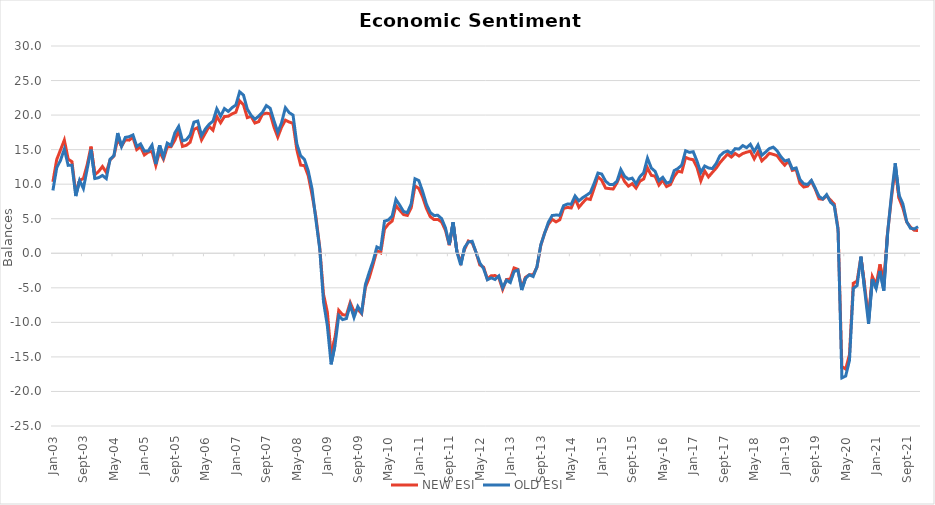
| Category | NEW ESI | OLD ESI |
|---|---|---|
| 2003-01-01 | 10.342 | 9.092 |
| 2003-02-01 | 13.567 | 12.367 |
| 2003-03-01 | 14.967 | 13.467 |
| 2003-04-01 | 16.383 | 15.083 |
| 2003-05-01 | 13.625 | 12.725 |
| 2003-06-01 | 13.25 | 12.75 |
| 2003-07-01 | 8.675 | 8.275 |
| 2003-08-01 | 10.542 | 10.542 |
| 2003-09-01 | 10.825 | 9.375 |
| 2003-10-01 | 12.825 | 12.225 |
| 2003-11-01 | 15.442 | 14.992 |
| 2003-12-01 | 11.367 | 10.817 |
| 2004-01-01 | 11.842 | 10.942 |
| 2004-02-01 | 12.558 | 11.258 |
| 2004-03-01 | 11.708 | 10.808 |
| 2004-04-01 | 13.508 | 13.608 |
| 2004-05-01 | 14.067 | 14.117 |
| 2004-06-01 | 16.55 | 17.4 |
| 2004-07-01 | 15.475 | 15.475 |
| 2004-08-01 | 16.425 | 16.775 |
| 2004-09-01 | 16.375 | 16.875 |
| 2004-10-01 | 16.775 | 17.125 |
| 2004-11-01 | 15.008 | 15.458 |
| 2004-12-01 | 15.425 | 15.825 |
| 2005-01-01 | 14.233 | 14.783 |
| 2005-02-01 | 14.642 | 14.792 |
| 2005-03-01 | 14.75 | 15.65 |
| 2005-04-01 | 12.708 | 12.908 |
| 2005-05-01 | 14.725 | 15.625 |
| 2005-06-01 | 13.6 | 13.95 |
| 2005-07-01 | 15.392 | 15.942 |
| 2005-08-01 | 15.417 | 15.617 |
| 2005-09-01 | 16.375 | 17.425 |
| 2005-10-01 | 17.758 | 18.358 |
| 2005-11-01 | 15.467 | 16.267 |
| 2005-12-01 | 15.625 | 16.425 |
| 2006-01-01 | 16.067 | 17.117 |
| 2006-02-01 | 17.925 | 18.975 |
| 2006-03-01 | 18.192 | 19.142 |
| 2006-04-01 | 16.4 | 17.05 |
| 2006-05-01 | 17.392 | 17.992 |
| 2006-06-01 | 18.375 | 18.675 |
| 2006-07-01 | 17.817 | 19.117 |
| 2006-08-01 | 19.808 | 20.908 |
| 2006-09-01 | 18.892 | 19.842 |
| 2006-10-01 | 19.792 | 20.942 |
| 2006-11-01 | 19.833 | 20.533 |
| 2006-12-01 | 20.175 | 21.075 |
| 2007-01-01 | 20.408 | 21.458 |
| 2007-02-01 | 22.067 | 23.367 |
| 2007-03-01 | 21.492 | 22.892 |
| 2007-04-01 | 19.633 | 20.883 |
| 2007-05-01 | 19.808 | 19.958 |
| 2007-06-01 | 18.85 | 19.4 |
| 2007-07-01 | 19.05 | 19.85 |
| 2007-08-01 | 20.125 | 20.425 |
| 2007-09-01 | 20.275 | 21.375 |
| 2007-10-01 | 20.192 | 20.992 |
| 2007-11-01 | 18.275 | 19.175 |
| 2007-12-01 | 16.808 | 17.508 |
| 2008-01-01 | 18.258 | 18.908 |
| 2008-02-01 | 19.267 | 21.067 |
| 2008-03-01 | 19 | 20.35 |
| 2008-04-01 | 18.8 | 20 |
| 2008-05-01 | 14.983 | 15.833 |
| 2008-06-01 | 12.758 | 14.108 |
| 2008-07-01 | 12.683 | 13.583 |
| 2008-08-01 | 11.217 | 11.917 |
| 2008-09-01 | 8.433 | 9.283 |
| 2008-10-01 | 5.292 | 4.842 |
| 2008-11-01 | 0.883 | 0.683 |
| 2008-12-01 | -5.933 | -7.033 |
| 2009-01-01 | -8.5 | -10.46 |
| 2009-02-01 | -14.775 | -16.075 |
| 2009-03-01 | -12.25 | -13.36 |
| 2009-04-01 | -8.258 | -9.008 |
| 2009-05-01 | -8.9 | -9.6 |
| 2009-06-01 | -8.95 | -9.45 |
| 2009-07-01 | -7.125 | -7.475 |
| 2009-08-01 | -8.425 | -9.285 |
| 2009-09-01 | -8.1 | -7.7 |
| 2009-10-01 | -8.733 | -8.593 |
| 2009-11-01 | -4.908 | -4.508 |
| 2009-12-01 | -3.533 | -2.743 |
| 2010-01-01 | -1.642 | -1.142 |
| 2010-02-01 | 0.375 | 0.915 |
| 2010-03-01 | 0.075 | 0.625 |
| 2010-04-01 | 3.508 | 4.648 |
| 2010-05-01 | 4.217 | 4.817 |
| 2010-06-01 | 4.66 | 5.36 |
| 2010-07-01 | 6.905 | 7.795 |
| 2010-08-01 | 6.225 | 6.965 |
| 2010-09-01 | 5.6 | 6.04 |
| 2010-10-01 | 5.475 | 5.875 |
| 2010-11-01 | 6.565 | 7.155 |
| 2010-12-01 | 9.745 | 10.785 |
| 2011-01-01 | 9.385 | 10.525 |
| 2011-02-01 | 8.16 | 8.96 |
| 2011-03-01 | 6.505 | 7.105 |
| 2011-04-01 | 5.305 | 5.905 |
| 2011-05-01 | 4.875 | 5.475 |
| 2011-06-01 | 4.905 | 5.495 |
| 2011-07-01 | 4.515 | 5.005 |
| 2011-08-01 | 3.32 | 3.67 |
| 2011-09-01 | 1.165 | 1.265 |
| 2011-10-01 | 4.4 | 4.49 |
| 2011-11-01 | 0.24 | 0.19 |
| 2011-12-01 | -1.265 | -1.725 |
| 2012-01-01 | 0.545 | 0.835 |
| 2012-02-01 | 1.78 | 1.63 |
| 2012-03-01 | 1.54 | 1.74 |
| 2012-04-01 | 0.17 | 0.16 |
| 2012-05-01 | -1.69 | -1.39 |
| 2012-06-01 | -2.01 | -2.22 |
| 2012-07-01 | -3.725 | -3.835 |
| 2012-08-01 | -3.25 | -3.56 |
| 2012-09-01 | -3.23 | -3.79 |
| 2012-10-01 | -3.535 | -3.285 |
| 2012-11-01 | -5.235 | -4.995 |
| 2012-12-01 | -3.8 | -3.9 |
| 2013-01-01 | -3.725 | -4.235 |
| 2013-02-01 | -2.125 | -2.635 |
| 2013-03-01 | -2.33 | -2.44 |
| 2013-04-01 | -5.115 | -5.325 |
| 2013-05-01 | -3.475 | -3.635 |
| 2013-06-01 | -3.115 | -3.115 |
| 2013-07-01 | -3.12 | -3.37 |
| 2013-08-01 | -2.005 | -1.955 |
| 2013-09-01 | 1.115 | 1.205 |
| 2013-10-01 | 2.915 | 2.865 |
| 2013-11-01 | 4.205 | 4.495 |
| 2013-12-01 | 4.915 | 5.465 |
| 2014-01-01 | 4.545 | 5.535 |
| 2014-02-01 | 4.855 | 5.505 |
| 2014-03-01 | 6.5 | 6.9 |
| 2014-04-01 | 6.635 | 7.125 |
| 2014-05-01 | 6.555 | 7.105 |
| 2014-06-01 | 7.905 | 8.295 |
| 2014-07-01 | 6.65 | 7.59 |
| 2014-08-01 | 7.305 | 8.045 |
| 2014-09-01 | 7.91 | 8.4 |
| 2014-10-01 | 7.785 | 8.785 |
| 2014-11-01 | 9.39 | 10.1 |
| 2014-12-01 | 11.1 | 11.61 |
| 2015-01-01 | 10.555 | 11.465 |
| 2015-02-01 | 9.43 | 10.44 |
| 2015-03-01 | 9.36 | 9.97 |
| 2015-04-01 | 9.3 | 9.95 |
| 2015-05-01 | 10.215 | 10.425 |
| 2015-06-01 | 11.525 | 12.125 |
| 2015-07-01 | 10.375 | 11.135 |
| 2015-08-01 | 9.72 | 10.73 |
| 2015-09-01 | 10.075 | 10.875 |
| 2015-10-01 | 9.435 | 10.035 |
| 2015-11-01 | 10.42 | 11.07 |
| 2015-12-01 | 10.75 | 11.65 |
| 2016-01-01 | 12.365 | 13.765 |
| 2016-02-01 | 11.28 | 12.34 |
| 2016-03-01 | 11.155 | 11.855 |
| 2016-04-01 | 9.87 | 10.52 |
| 2016-05-01 | 10.59 | 10.99 |
| 2016-06-01 | 9.66 | 10.16 |
| 2016-07-01 | 9.94 | 10.34 |
| 2016-08-01 | 11.11 | 11.96 |
| 2016-09-01 | 11.87 | 12.27 |
| 2016-10-01 | 11.765 | 12.765 |
| 2016-11-01 | 13.88 | 14.83 |
| 2016-12-01 | 13.645 | 14.605 |
| 2017-01-01 | 13.545 | 14.695 |
| 2017-02-01 | 12.41 | 13.32 |
| 2017-03-01 | 10.49 | 11.7 |
| 2017-04-01 | 11.925 | 12.625 |
| 2017-05-01 | 11.05 | 12.35 |
| 2017-06-01 | 11.69 | 12.25 |
| 2017-07-01 | 12.31 | 12.97 |
| 2017-08-01 | 13.1 | 14.1 |
| 2017-09-01 | 13.735 | 14.595 |
| 2017-10-01 | 14.35 | 14.81 |
| 2017-11-01 | 13.925 | 14.485 |
| 2017-12-01 | 14.445 | 15.145 |
| 2018-01-01 | 14.075 | 15.085 |
| 2018-02-01 | 14.435 | 15.585 |
| 2018-03-01 | 14.63 | 15.29 |
| 2018-04-01 | 14.77 | 15.77 |
| 2018-05-01 | 13.665 | 14.725 |
| 2018-06-01 | 14.675 | 15.675 |
| 2018-07-01 | 13.375 | 14.185 |
| 2018-08-01 | 13.89 | 14.65 |
| 2018-09-01 | 14.47 | 15.17 |
| 2018-10-01 | 14.31 | 15.36 |
| 2018-11-01 | 14.13 | 14.83 |
| 2018-12-01 | 13.375 | 13.985 |
| 2019-01-01 | 12.75 | 13.36 |
| 2019-02-01 | 13.37 | 13.52 |
| 2019-03-01 | 11.995 | 12.205 |
| 2019-04-01 | 12.145 | 12.345 |
| 2019-05-01 | 10.125 | 10.685 |
| 2019-06-01 | 9.59 | 10.05 |
| 2019-07-01 | 9.715 | 9.965 |
| 2019-08-01 | 10.435 | 10.545 |
| 2019-09-01 | 9.295 | 9.445 |
| 2019-10-01 | 7.89 | 8.25 |
| 2019-11-01 | 7.815 | 7.855 |
| 2019-12-01 | 8.33 | 8.48 |
| 2020-01-01 | 7.715 | 7.405 |
| 2020-02-01 | 7.135 | 6.885 |
| 2020-03-01 | 3.59 | 3.38 |
| 2020-04-01 | -16.38 | -18.04 |
| 2020-05-01 | -16.76 | -17.77 |
| 2020-06-01 | -14.655 | -15.505 |
| 2020-07-01 | -4.34 | -5.09 |
| 2020-08-01 | -4.02 | -4.67 |
| 2020-09-01 | -0.53 | -0.48 |
| 2020-10-01 | -4.785 | -5.395 |
| 2020-11-01 | -9.425 | -10.225 |
| 2020-12-01 | -3.385 | -3.735 |
| 2021-01-01 | -4.535 | -5.095 |
| 2021-02-01 | -1.605 | -2.555 |
| 2021-03-01 | -4.4 | -5.4 |
| 2021-04-01 | 3.01 | 2.9 |
| 2021-05-01 | 7.935 | 8.385 |
| 2021-06-01 | 12.425 | 13.025 |
| 2021-07-01 | 7.97 | 8.41 |
| 2021-08-01 | 6.56 | 7.16 |
| 2021-09-01 | 4.535 | 4.585 |
| 2021-10-01 | 3.8 | 3.62 |
| 2021-11-01 | 3.32 | 3.52 |
| 2021-12-01 | 3.305 | 3.845 |